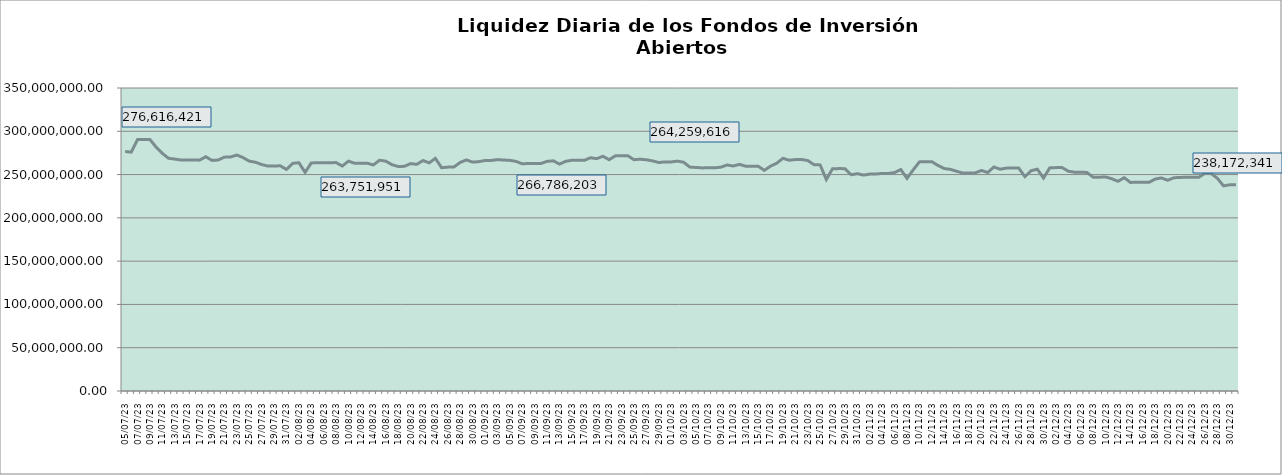
| Category | Series 0 |
|---|---|
| 2023-07-05 | 276616420.75 |
| 2023-07-06 | 275908832.297 |
| 2023-07-07 | 290509457.339 |
| 2023-07-08 | 290530745.045 |
| 2023-07-09 | 290500700.92 |
| 2023-07-10 | 281672092.148 |
| 2023-07-11 | 274485433.359 |
| 2023-07-12 | 268832406.061 |
| 2023-07-13 | 267884980.605 |
| 2023-07-14 | 266845119.954 |
| 2023-07-15 | 266971803.666 |
| 2023-07-16 | 266936846.31 |
| 2023-07-17 | 266651913.141 |
| 2023-07-18 | 270607839.362 |
| 2023-07-19 | 266335659.844 |
| 2023-07-20 | 266821355.791 |
| 2023-07-21 | 270136036.327 |
| 2023-07-22 | 270271307.023 |
| 2023-07-23 | 272603082.168 |
| 2023-07-24 | 269630484.751 |
| 2023-07-25 | 265520024.425 |
| 2023-07-26 | 264274687.132 |
| 2023-07-27 | 261648582.597 |
| 2023-07-28 | 259831164.452 |
| 2023-07-29 | 259917867.964 |
| 2023-07-30 | 260119190.517 |
| 2023-07-31 | 255949717.596 |
| 2023-08-01 | 262960908.589 |
| 2023-08-02 | 263693211.5 |
| 2023-08-03 | 252587114.018 |
| 2023-08-04 | 263399541.757 |
| 2023-08-05 | 263751950.728 |
| 2023-08-06 | 263715354.477 |
| 2023-08-07 | 263707366.27 |
| 2023-08-08 | 263835951.564 |
| 2023-08-09 | 259861013.324 |
| 2023-08-10 | 265558091.974 |
| 2023-08-11 | 262963294.934 |
| 2023-08-12 | 263184195.567 |
| 2023-08-13 | 263147018.873 |
| 2023-08-14 | 261126587.952 |
| 2023-08-15 | 266535446.619 |
| 2023-08-16 | 265533876.59 |
| 2023-08-17 | 261399660.613 |
| 2023-08-18 | 259326099.452 |
| 2023-08-19 | 259517194.009 |
| 2023-08-20 | 262647342.711 |
| 2023-08-21 | 261817607.125 |
| 2023-08-22 | 266211915.085 |
| 2023-08-23 | 263532621.88 |
| 2023-08-24 | 268711732.735 |
| 2023-08-25 | 257896483.833 |
| 2023-08-26 | 258603362.146 |
| 2023-08-27 | 258800802.97 |
| 2023-08-28 | 264016817.866 |
| 2023-08-29 | 266936576.685 |
| 2023-08-30 | 264377960.433 |
| 2023-08-31 | 264919626.535 |
| 2023-09-01 | 266220826.289 |
| 2023-09-02 | 266254314.624 |
| 2023-09-03 | 267275317.047 |
| 2023-09-04 | 266786203.118 |
| 2023-09-05 | 266429955.946 |
| 2023-09-06 | 265191083.221 |
| 2023-09-07 | 262416869.816 |
| 2023-09-08 | 262813943.83 |
| 2023-09-09 | 262828197.484 |
| 2023-09-10 | 262794201.156 |
| 2023-09-11 | 265246454.988 |
| 2023-09-12 | 265885477.265 |
| 2023-09-13 | 262090279.767 |
| 2023-09-14 | 265282235.173 |
| 2023-09-15 | 266538193.446 |
| 2023-09-16 | 266506213.671 |
| 2023-09-17 | 266472323.274 |
| 2023-09-18 | 269415489.745 |
| 2023-09-19 | 268393968.564 |
| 2023-09-20 | 271118512.787 |
| 2023-09-21 | 267151429.009 |
| 2023-09-22 | 271649914.076 |
| 2023-09-23 | 271748703.06 |
| 2023-09-24 | 271770482.346 |
| 2023-09-25 | 267170979.218 |
| 2023-09-26 | 267723014.799 |
| 2023-09-27 | 267121966.702 |
| 2023-09-28 | 265799818.159 |
| 2023-09-29 | 263898358.943 |
| 2023-09-30 | 264641864.972 |
| 2023-10-01 | 264607270.205 |
| 2023-10-02 | 265535395.025 |
| 2023-10-03 | 264259616.24 |
| 2023-10-04 | 258631816.095 |
| 2023-10-05 | 258211071.577 |
| 2023-10-06 | 257682526.507 |
| 2023-10-07 | 257838171.159 |
| 2023-10-08 | 257802919.269 |
| 2023-10-09 | 258535444.184 |
| 2023-10-10 | 261080012.107 |
| 2023-10-11 | 259892522.793 |
| 2023-10-12 | 261781355.833 |
| 2023-10-13 | 259723591.712 |
| 2023-10-14 | 259682344.781 |
| 2023-10-15 | 259753721.682 |
| 2023-10-16 | 254816202.586 |
| 2023-10-17 | 259685347.671 |
| 2023-10-18 | 263063447.589 |
| 2023-10-19 | 268785267.379 |
| 2023-10-20 | 266549519.544 |
| 2023-10-21 | 267347341.576 |
| 2023-10-22 | 267392790.548 |
| 2023-10-23 | 266261707.901 |
| 2023-10-24 | 261485412.164 |
| 2023-10-25 | 261144193.272 |
| 2023-10-26 | 244297675.683 |
| 2023-10-27 | 256729419.724 |
| 2023-10-28 | 256886413.383 |
| 2023-10-29 | 256852097.621 |
| 2023-10-30 | 249770600.713 |
| 2023-10-31 | 251027206.23 |
| 2023-11-01 | 249399146.68 |
| 2023-11-02 | 250522883.579 |
| 2023-11-03 | 250707403.984 |
| 2023-11-04 | 251309561.833 |
| 2023-11-05 | 251313977.66 |
| 2023-11-06 | 252314887.688 |
| 2023-11-07 | 255844702.476 |
| 2023-11-08 | 245574235.717 |
| 2023-11-09 | 255420856.736 |
| 2023-11-10 | 264662001.213 |
| 2023-11-11 | 264837682.546 |
| 2023-11-12 | 264943434.844 |
| 2023-11-13 | 260469814.794 |
| 2023-11-14 | 256963288.491 |
| 2023-11-15 | 256000079.751 |
| 2023-11-16 | 253807967.131 |
| 2023-11-17 | 251738128.487 |
| 2023-11-18 | 251795907.763 |
| 2023-11-19 | 251960905.278 |
| 2023-11-20 | 254745591.568 |
| 2023-11-21 | 252323156.445 |
| 2023-11-22 | 258729164.752 |
| 2023-11-23 | 256201228.927 |
| 2023-11-24 | 257442052.141 |
| 2023-11-25 | 257480210.406 |
| 2023-11-26 | 257570307.961 |
| 2023-11-27 | 247612538.353 |
| 2023-11-28 | 254444757.438 |
| 2023-11-29 | 256218565.281 |
| 2023-11-30 | 246011458.878 |
| 2023-12-01 | 257735541.882 |
| 2023-12-02 | 258063550.214 |
| 2023-12-03 | 258076340.824 |
| 2023-12-04 | 253849301.49 |
| 2023-12-05 | 252753025.599 |
| 2023-12-06 | 252736491.956 |
| 2023-12-07 | 252404871.445 |
| 2023-12-08 | 246927818.41 |
| 2023-12-09 | 246953256.105 |
| 2023-12-10 | 247281252.958 |
| 2023-12-11 | 245119453.734 |
| 2023-12-12 | 242227592.669 |
| 2023-12-13 | 246384462.276 |
| 2023-12-14 | 240946385.122 |
| 2023-12-15 | 241064980.963 |
| 2023-12-16 | 240992511.623 |
| 2023-12-17 | 240990600.555 |
| 2023-12-18 | 244791474.498 |
| 2023-12-19 | 246134212.999 |
| 2023-12-20 | 243400371.44 |
| 2023-12-21 | 246307557.384 |
| 2023-12-22 | 246716646.868 |
| 2023-12-23 | 246844229.925 |
| 2023-12-24 | 246810014.611 |
| 2023-12-25 | 246810969.504 |
| 2023-12-26 | 251398217.282 |
| 2023-12-27 | 251226380.292 |
| 2023-12-28 | 245771873.556 |
| 2023-12-29 | 236964673.697 |
| 2023-12-30 | 238177303.706 |
| 2023-12-31 | 238172340.821 |